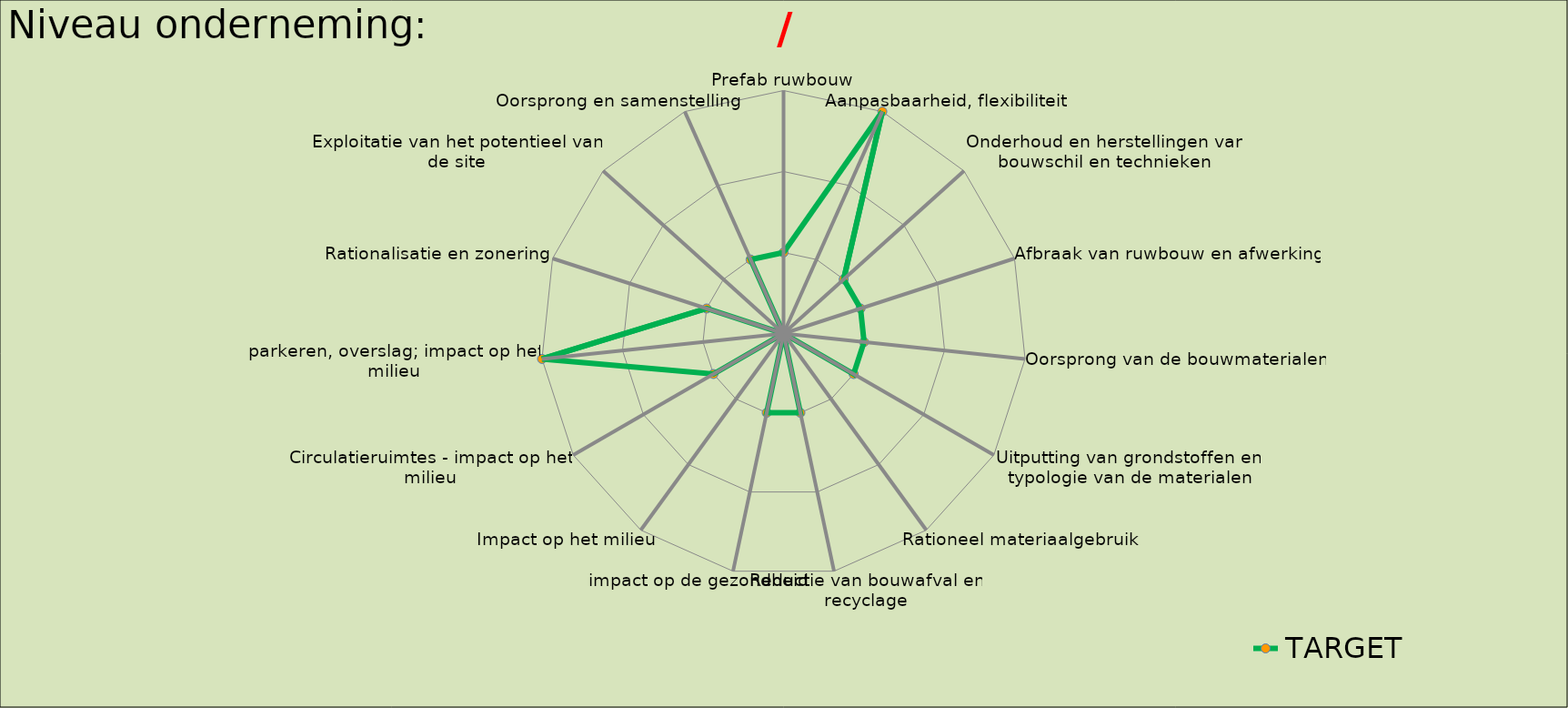
| Category | TARGET |
|---|---|
| Prefab ruwbouw | -1 |
| Aanpasbaarheid, flexibiliteit | 3 |
| Onderhoud en herstellingen van bouwschil en technieken | -1 |
| Afbraak van ruwbouw en afwerking | -1 |
| Oorsprong van de bouwmaterialen | -1 |
| Uitputting van grondstoffen en typologie van de materialen | -1 |
| Rationeel materiaalgebruik | 0 |
| Reductie van bouwafval en recyclage | -1 |
| impact op de gezondheid  | 1 |
| Impact op het milieu | 0 |
| Circulatieruimtes - impact op het milieu | -1 |
| parkeren, overslag; impact op het milieu | 3 |
| Rationalisatie en zonering | 1 |
| Exploitatie van het potentieel van de site | 0 |
| Oorsprong en samenstelling | 1 |